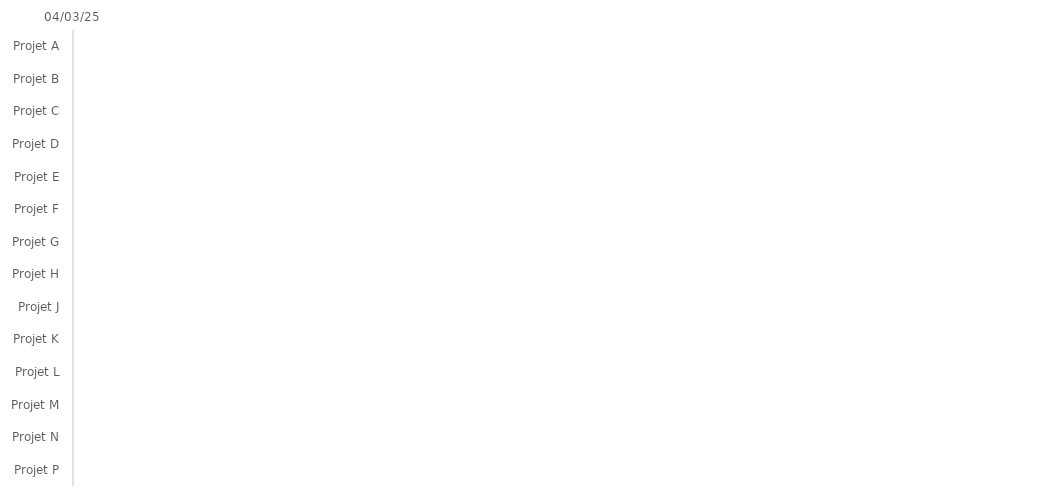
| Category | DÉBUT | Durée |
|---|---|---|
| Projet A |  | 0 |
| Projet B |  | 0 |
| Projet C |  | 0 |
| Projet D |  | 0 |
| Projet E |  | 0 |
| Projet F |  | 0 |
| Projet G |  | 0 |
| Projet H |  | 0 |
| Projet J |  | 0 |
| Projet K |  | 0 |
| Projet L |  | 0 |
| Projet M |  | 0 |
| Projet N |  | 0 |
| Projet P |  | 0 |